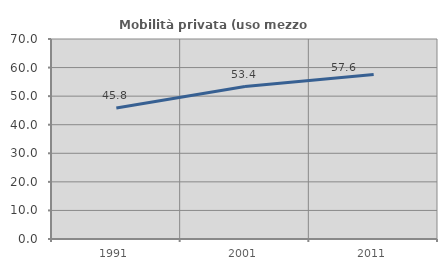
| Category | Mobilità privata (uso mezzo privato) |
|---|---|
| 1991.0 | 45.846 |
| 2001.0 | 53.362 |
| 2011.0 | 57.605 |